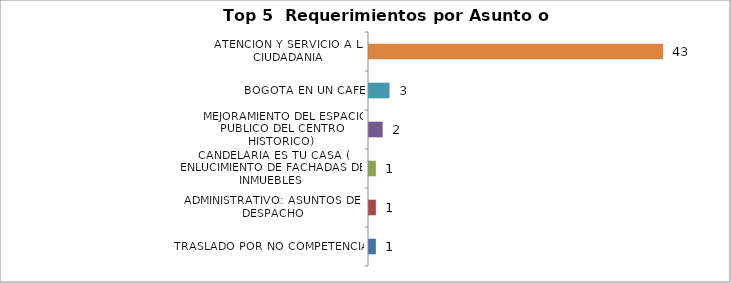
| Category | Total |
|---|---|
| TRASLADO POR NO COMPETENCIA | 1 |
| ADMINISTRATIVO: ASUNTOS DEL DESPACHO | 1 |
| CANDELARIA ES TU CASA ( ENLUCIMIENTO DE FACHADAS DE INMUEBLES, MEJORAMIENTO DEL ESPACIO PUBLICO DEL CENTRO HISTORICO) | 1 |
| BOGOTA EN UN CAFE | 2 |
| ATENCION Y SERVICIO A LA CIUDADANIA | 3 |
| BIENES DE INTERES | 43 |